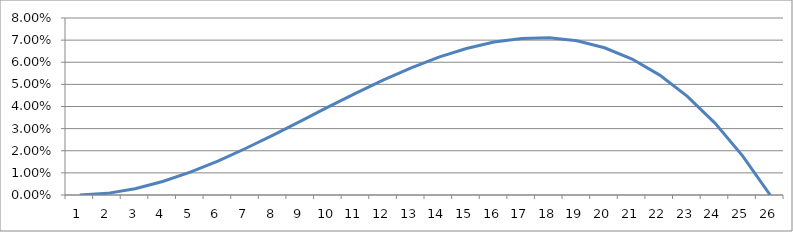
| Category | 3.00 | Series 2 |
|---|---|---|
| 0 | 0 |  |
| 1 | 0.001 |  |
| 2 | 0.003 |  |
| 3 | 0.006 |  |
| 4 | 0.01 |  |
| 5 | 0.015 |  |
| 6 | 0.021 |  |
| 7 | 0.027 |  |
| 8 | 0.033 |  |
| 9 | 0.04 |  |
| 10 | 0.046 |  |
| 11 | 0.052 |  |
| 12 | 0.058 |  |
| 13 | 0.062 |  |
| 14 | 0.066 |  |
| 15 | 0.069 |  |
| 16 | 0.071 |  |
| 17 | 0.071 |  |
| 18 | 0.07 |  |
| 19 | 0.067 |  |
| 20 | 0.061 |  |
| 21 | 0.054 |  |
| 22 | 0.045 |  |
| 23 | 0.033 |  |
| 24 | 0.018 |  |
| 25 | 0 |  |